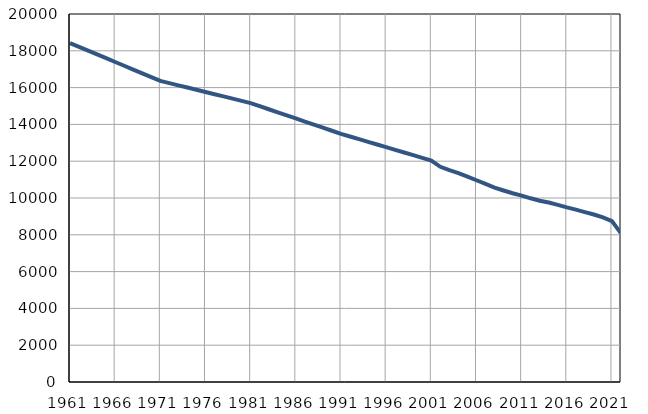
| Category | Population
size |
|---|---|
| 1961.0 | 18418 |
| 1962.0 | 18213 |
| 1963.0 | 18007 |
| 1964.0 | 17802 |
| 1965.0 | 17597 |
| 1966.0 | 17391 |
| 1967.0 | 17186 |
| 1968.0 | 16981 |
| 1969.0 | 16776 |
| 1970.0 | 16570 |
| 1971.0 | 16365 |
| 1972.0 | 16244 |
| 1973.0 | 16124 |
| 1974.0 | 16003 |
| 1975.0 | 15882 |
| 1976.0 | 15762 |
| 1977.0 | 15641 |
| 1978.0 | 15520 |
| 1979.0 | 15399 |
| 1980.0 | 15279 |
| 1981.0 | 15158 |
| 1982.0 | 14991 |
| 1983.0 | 14824 |
| 1984.0 | 14657 |
| 1985.0 | 14491 |
| 1986.0 | 14323 |
| 1987.0 | 14156 |
| 1988.0 | 13989 |
| 1989.0 | 13822 |
| 1990.0 | 13655 |
| 1991.0 | 13488 |
| 1992.0 | 13343 |
| 1993.0 | 13198 |
| 1994.0 | 13053 |
| 1995.0 | 12908 |
| 1996.0 | 12763 |
| 1997.0 | 12618 |
| 1998.0 | 12473 |
| 1999.0 | 12328 |
| 2000.0 | 12183 |
| 2001.0 | 12038 |
| 2002.0 | 11697 |
| 2003.0 | 11515 |
| 2004.0 | 11355 |
| 2005.0 | 11167 |
| 2006.0 | 10964 |
| 2007.0 | 10765 |
| 2008.0 | 10566 |
| 2009.0 | 10407 |
| 2010.0 | 10258 |
| 2011.0 | 10133 |
| 2012.0 | 9984 |
| 2013.0 | 9854 |
| 2014.0 | 9758 |
| 2015.0 | 9623 |
| 2016.0 | 9487 |
| 2017.0 | 9367 |
| 2018.0 | 9234 |
| 2019.0 | 9104 |
| 2020.0 | 8944 |
| 2021.0 | 8741 |
| 2022.0 | 8077 |